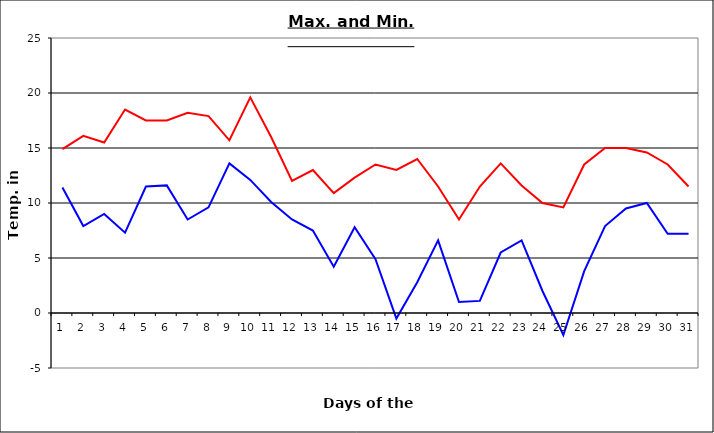
| Category | Series 0 | Series 1 |
|---|---|---|
| 0 | 14.9 | 11.4 |
| 1 | 16.1 | 7.9 |
| 2 | 15.5 | 9 |
| 3 | 18.5 | 7.3 |
| 4 | 17.5 | 11.5 |
| 5 | 17.5 | 11.6 |
| 6 | 18.2 | 8.5 |
| 7 | 17.9 | 9.6 |
| 8 | 15.7 | 13.6 |
| 9 | 19.6 | 12.1 |
| 10 | 16 | 10.1 |
| 11 | 12 | 8.5 |
| 12 | 13 | 7.5 |
| 13 | 10.9 | 4.2 |
| 14 | 12.3 | 7.8 |
| 15 | 13.5 | 4.9 |
| 16 | 13 | -0.5 |
| 17 | 14 | 2.8 |
| 18 | 11.5 | 6.6 |
| 19 | 8.5 | 1 |
| 20 | 11.5 | 1.1 |
| 21 | 13.6 | 5.5 |
| 22 | 11.6 | 6.6 |
| 23 | 10 | 2 |
| 24 | 9.6 | -2 |
| 25 | 13.5 | 3.8 |
| 26 | 15 | 7.9 |
| 27 | 15 | 9.5 |
| 28 | 14.6 | 10 |
| 29 | 13.5 | 7.2 |
| 30 | 11.5 | 7.2 |